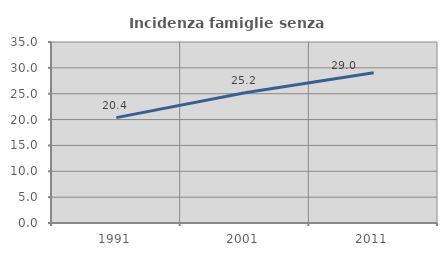
| Category | Incidenza famiglie senza nuclei |
|---|---|
| 1991.0 | 20.378 |
| 2001.0 | 25.181 |
| 2011.0 | 29.04 |